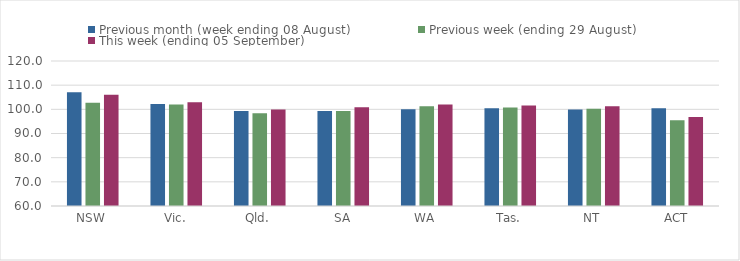
| Category | Previous month (week ending 08 August) | Previous week (ending 29 August) | This week (ending 05 September) |
|---|---|---|---|
| NSW | 107.06 | 102.72 | 106.03 |
| Vic. | 102.22 | 101.98 | 102.92 |
| Qld. | 99.27 | 98.38 | 99.9 |
| SA | 99.35 | 99.29 | 100.91 |
| WA | 100.08 | 101.31 | 101.96 |
| Tas. | 100.43 | 100.76 | 101.56 |
| NT | 99.91 | 100.28 | 101.24 |
| ACT | 100.42 | 95.46 | 96.84 |